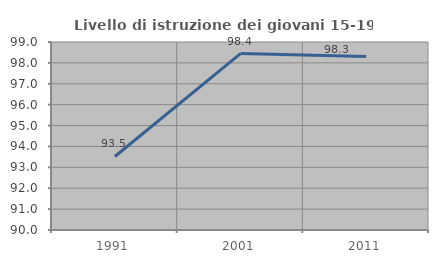
| Category | Livello di istruzione dei giovani 15-19 anni |
|---|---|
| 1991.0 | 93.52 |
| 2001.0 | 98.444 |
| 2011.0 | 98.301 |